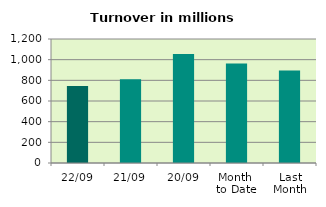
| Category | Series 0 |
|---|---|
| 22/09 | 744.038 |
| 21/09 | 810.419 |
| 20/09 | 1055.393 |
| Month 
to Date | 962.002 |
| Last
Month | 893.956 |